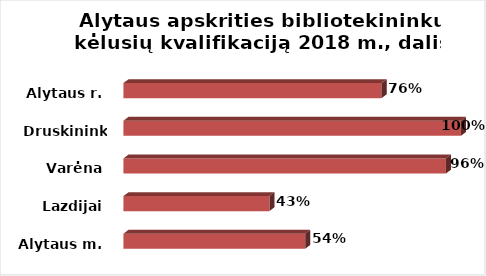
| Category | Series 0 |
|---|---|
| Alytaus m. | 0.538 |
| Lazdijai | 0.432 |
| Varėna | 0.956 |
| Druskininkai | 1 |
| Alytaus r. | 0.765 |